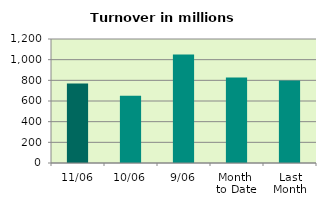
| Category | Series 0 |
|---|---|
| 11/06 | 769.994 |
| 10/06 | 650.234 |
| 9/06 | 1048.834 |
| Month 
to Date | 827.215 |
| Last
Month | 798.504 |